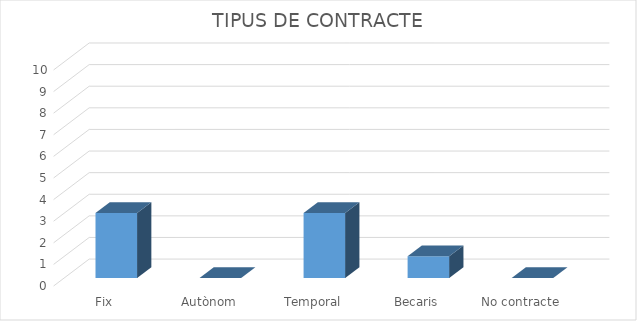
| Category | Series 0 |
|---|---|
| Fix | 3 |
| Autònom | 0 |
| Temporal | 3 |
| Becaris | 1 |
| No contracte | 0 |